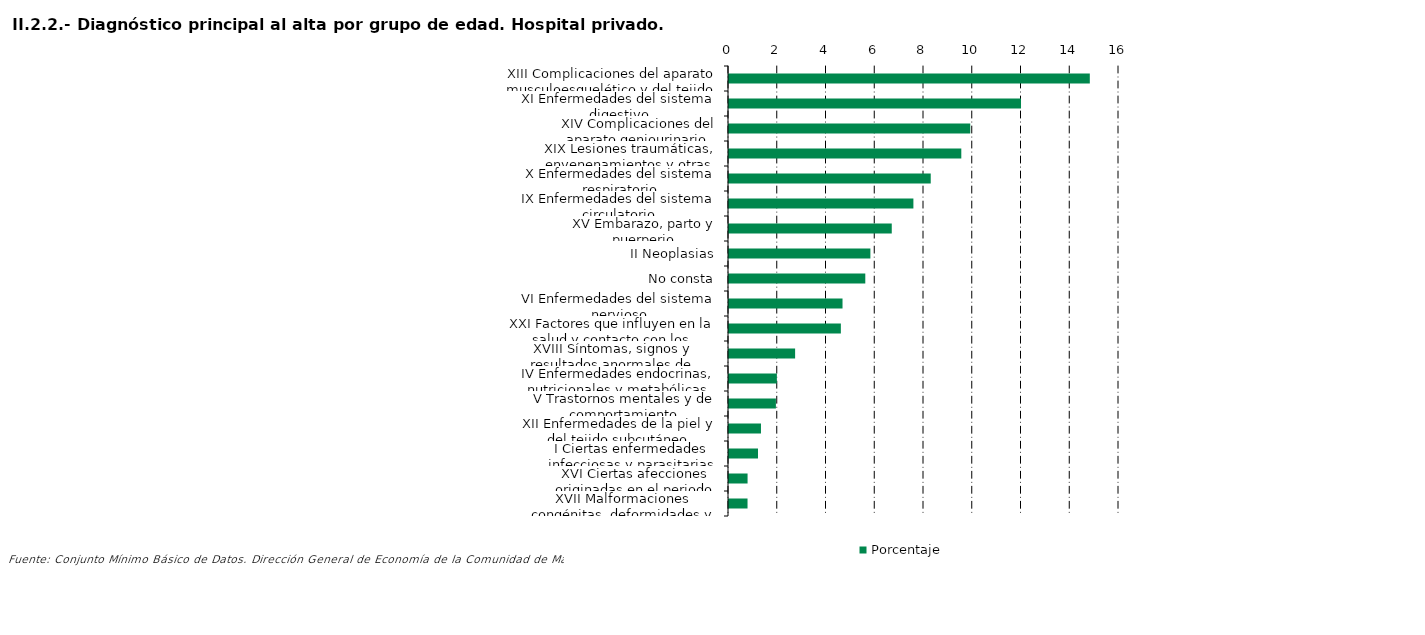
| Category | Porcentaje |
|---|---|
| XIII Complicaciones del aparato musculoesquelético y del tejido conectivo | 14.803 |
| XI Enfermedades del sistema digestivo | 11.98 |
| XIV Complicaciones del aparato geniourinario | 9.898 |
| XIX Lesiones traumáticas, envenenamientos y otras consecuencias de causas externas | 9.531 |
| X Enfermedades del sistema respiratorio | 8.276 |
| IX Enfermedades del sistema circulatorio | 7.565 |
| XV Embarazo, parto y puerperio | 6.677 |
| II Neoplasias | 5.801 |
| No consta | 5.592 |
| VI Enfermedades del sistema nervioso | 4.657 |
| XXI Factores que influyen en la salud y contacto con los servicios sanitarios | 4.589 |
| XVIII Síntomas, signos y resultados anormales de pruebas complementarias, no clasificados bajo otro concepto | 2.712 |
| IV Enfermedades endocrinas, nutricionales y metabólicas | 1.964 |
| V Trastornos mentales y de comportamiento | 1.924 |
| XII Enfermedades de la piel y del tejido subcutáneo | 1.312 |
| I Ciertas enfermedades infecciosas y parasitarias | 1.189 |
| XVI Ciertas afecciones originadas en el periodo perinatal | 0.762 |
| XVII Malformaciones congénitas, deformidades y anomalías cromosómicas | 0.76 |